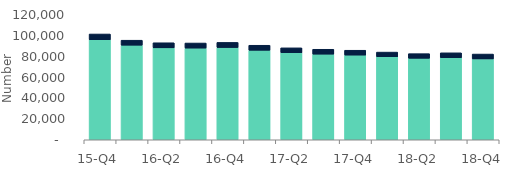
| Category | Homeowners | Buy-to-let |
|---|---|---|
| 15-Q4 | 96010 | 5530 |
| 16-Q1 | 90790 | 4800 |
| 16-Q2 | 88270 | 4870 |
| 16-Q3 | 88010 | 4880 |
| 16-Q4 | 88550 | 4930 |
| 17-Q1 | 85930 | 4810 |
| 17-Q2 | 83560 | 4700 |
| 17-Q3 | 82200 | 4690 |
| 17-Q4 | 81290 | 4670 |
| 18-Q1 | 79670 | 4500 |
| 18-Q2 | 78240 | 4440 |
| 18-Q3 | 78780 | 4710 |
| 18-Q4 | 77610 | 4690 |